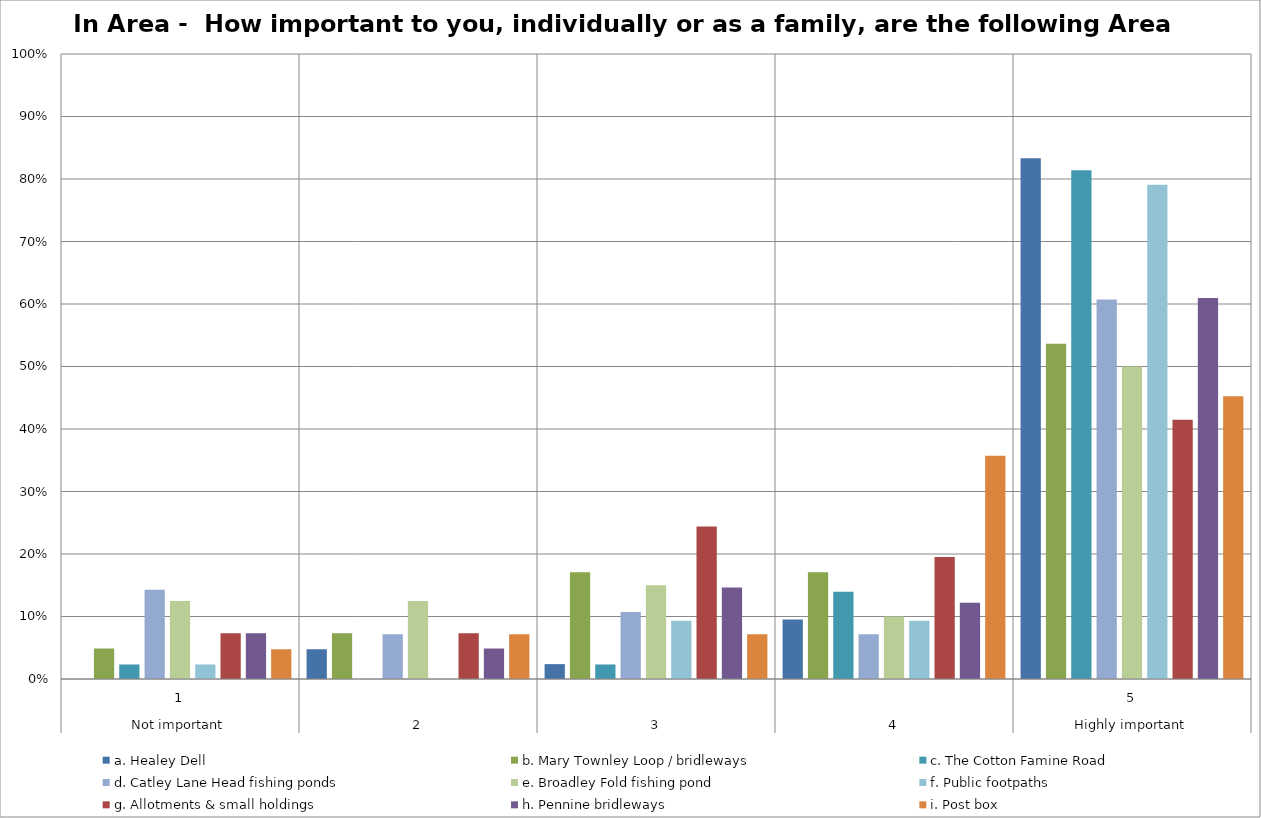
| Category | a. Healey Dell | b. Mary Townley Loop / bridleways | c. The Cotton Famine Road | d. Catley Lane Head fishing ponds | e. Broadley Fold fishing pond | f. Public footpaths | g. Allotments & small holdings | h. Pennine bridleways | i. Post box |
|---|---|---|---|---|---|---|---|---|---|
| 0 | 0 | 0.049 | 0.023 | 0.143 | 0.125 | 0.023 | 0.073 | 0.073 | 0.048 |
| 1 | 0.048 | 0.073 | 0 | 0.071 | 0.125 | 0 | 0.073 | 0.049 | 0.071 |
| 2 | 0.024 | 0.171 | 0.023 | 0.107 | 0.15 | 0.093 | 0.244 | 0.146 | 0.071 |
| 3 | 0.095 | 0.171 | 0.14 | 0.071 | 0.1 | 0.093 | 0.195 | 0.122 | 0.357 |
| 4 | 0.833 | 0.537 | 0.814 | 0.607 | 0.5 | 0.791 | 0.415 | 0.61 | 0.452 |